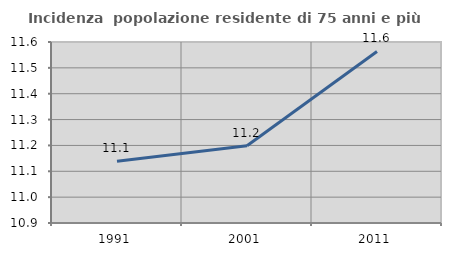
| Category | Incidenza  popolazione residente di 75 anni e più |
|---|---|
| 1991.0 | 11.139 |
| 2001.0 | 11.199 |
| 2011.0 | 11.563 |